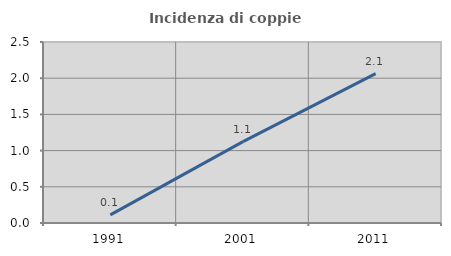
| Category | Incidenza di coppie miste |
|---|---|
| 1991.0 | 0.112 |
| 2001.0 | 1.124 |
| 2011.0 | 2.064 |